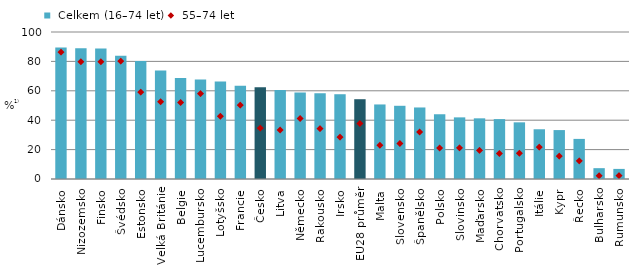
| Category |  Celkem (16–74 let) |
|---|---|
| Dánsko | 89.473 |
| Nizozemsko | 88.94 |
| Finsko | 88.713 |
| Švédsko | 83.859 |
| Estonsko | 80.357 |
| Velká Británie | 73.882 |
| Belgie | 68.742 |
| Lucembursko | 67.668 |
| Lotyšsko | 66.334 |
| Francie | 63.481 |
| Česko | 62.421 |
| Litva | 60.621 |
| Německo | 58.837 |
| Rakousko | 58.408 |
| Irsko | 57.668 |
| EU28 průměr | 54.277 |
| Malta | 50.713 |
| Slovensko | 49.804 |
| Španělsko | 48.661 |
| Polsko | 44.011 |
| Slovinsko | 41.924 |
| Maďarsko | 41.27 |
| Chorvatsko | 40.74 |
| Portugalsko | 38.549 |
| Itálie | 33.834 |
| Kypr | 33.281 |
| Řecko | 27.278 |
| Bulharsko | 7.37 |
| Rumunsko | 6.866 |